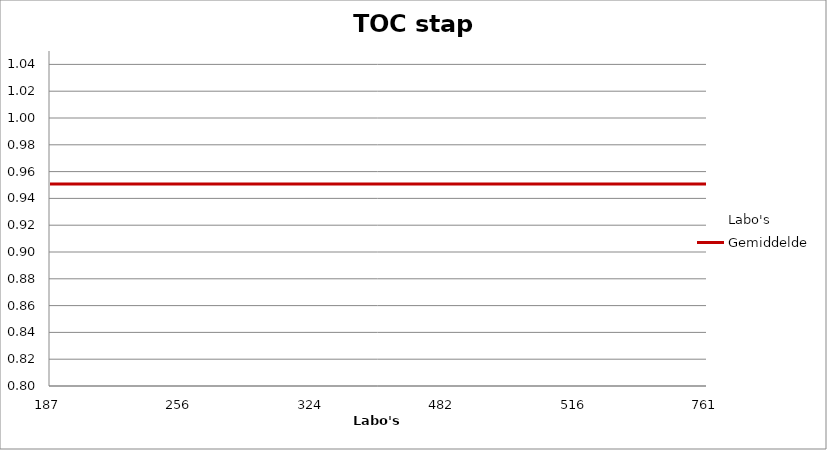
| Category | Labo's | Gemiddelde |
|---|---|---|
| 187.0 | 0.97 | 0.951 |
| 256.0 | 0.81 | 0.951 |
| 324.0 | 0.97 | 0.951 |
| 482.0 | 0.97 | 0.951 |
| 516.0 | 0.93 | 0.951 |
| 761.0 | 0.96 | 0.951 |